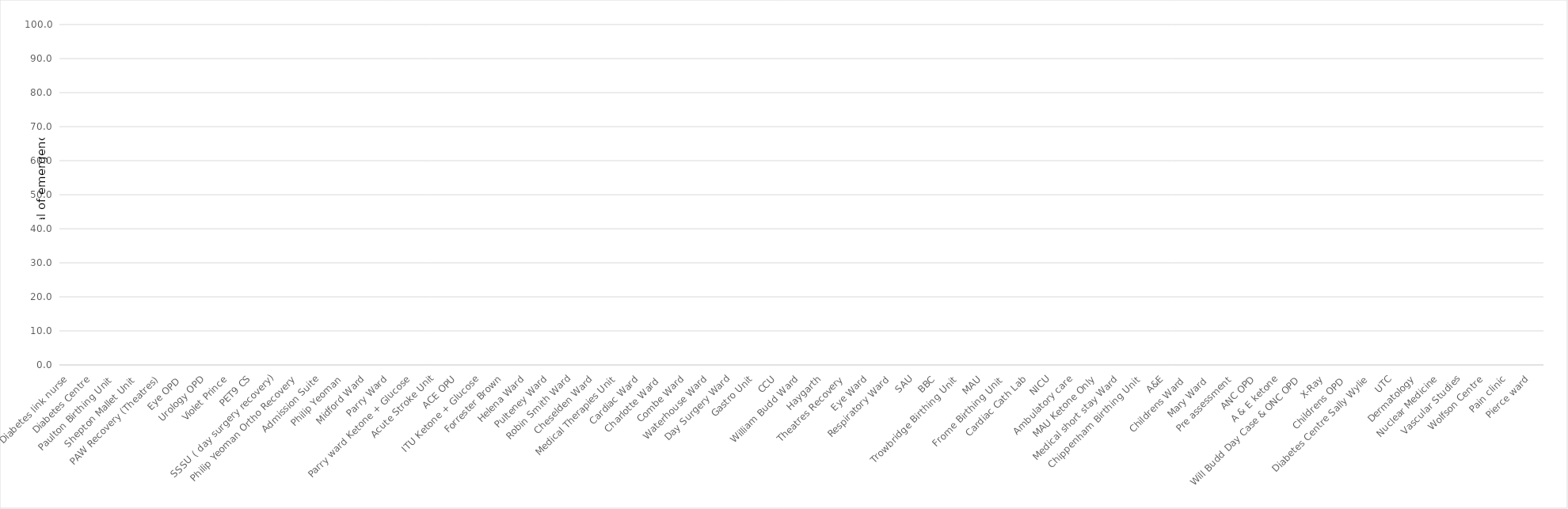
| Category | Series 1 |
|---|---|
| Diabetes link nurse | 0 |
| Diabetes Centre | 0 |
| Paulton Birthing Unit  | 0 |
| Shepton Mallet Unit  | 0 |
| PAW Recovery (Theatres) | 0 |
| Eye OPD  | 0 |
| Urology OPD | 0 |
| Violet Prince | 0 |
| PET9 CS | 0 |
| SSSU ( day surgery recovery) | 0 |
| Philip Yeoman Ortho Recovery | 0 |
| Admission Suite | 0 |
| Philip Yeoman | 0 |
| Midford Ward | 0 |
| Parry Ward | 0 |
| Parry ward Ketone + Glucose | 0 |
| Acute Stroke Unit | 0 |
| ACE OPU | 0 |
| ITU Ketone + Glucose | 0 |
| Forrester Brown | 0 |
| Helena Ward | 0 |
| Pulteney Ward | 0 |
| Robin Smith Ward | 0 |
| Cheselden Ward | 0 |
| Medical Therapies Unit | 0 |
| Cardiac Ward | 0 |
| Charlotte Ward  | 0 |
| Combe Ward | 0 |
| Waterhouse Ward | 0 |
| Day Surgery Ward | 0 |
| Gastro Unit | 0 |
| CCU | 0 |
| William Budd Ward | 0 |
| Haygarth | 0 |
| Theatres Recovery | 0 |
| Eye Ward | 0 |
| Respiratory Ward | 0 |
| SAU | 0 |
| BBC | 0 |
| Trowbridge Birthing Unit  | 0 |
| MAU | 0 |
| Frome Birthing Unit  | 0 |
| Cardiac Cath Lab | 0 |
| NICU | 0 |
| Ambulatory care | 0 |
| MAU Ketone Only | 0 |
| Medical short stay Ward | 0 |
| Chippenham Birthing Unit  | 0 |
| A&E | 0 |
| Childrens Ward  | 0 |
| Mary Ward  | 0 |
| Pre assessment | 0 |
| ANC OPD | 0 |
| A & E ketone | 0 |
| Will Budd Day Case & ONC OPD | 0 |
| X-Ray | 0 |
| Childrens OPD  | 0 |
| Diabetes Centre Sally Wylie | 0 |
| UTC | 0 |
| Dermatology | 0 |
| Nuclear Medicine | 0 |
| Vascular Studies | 0 |
| Wolfson Centre | 0 |
| Pain clinic | 0 |
| Pierce ward | 0 |